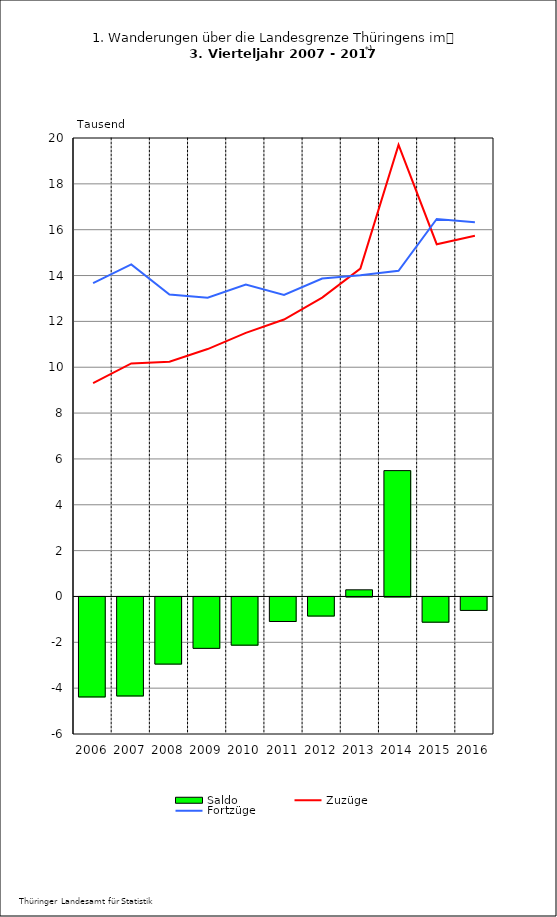
| Category | Saldo |
|---|---|
| 2006.0 | -4.361 |
| 2007.0 | -4.319 |
| 2008.0 | -2.929 |
| 2009.0 | -2.242 |
| 2010.0 | -2.102 |
| 2011.0 | -1.071 |
| 2012.0 | -0.832 |
| 2013.0 | 0.29 |
| 2014.0 | 5.49 |
| 2015.0 | -1.1 |
| 2016.0 | -0.587 |